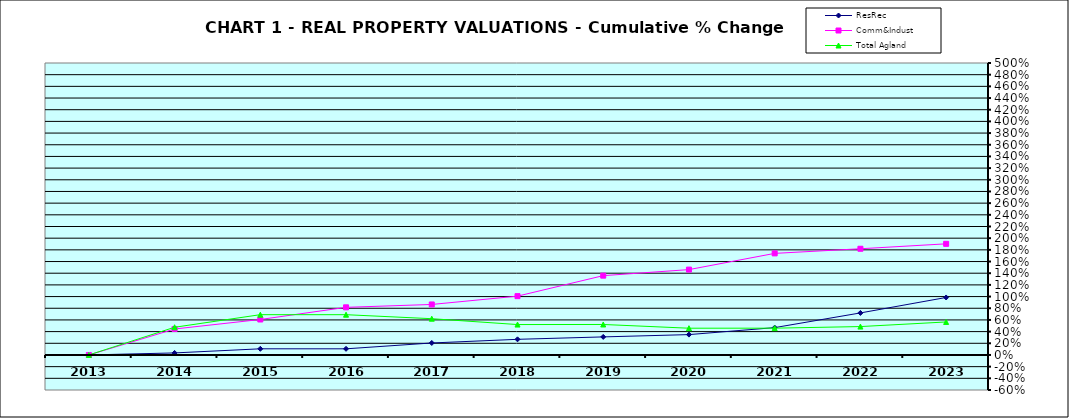
| Category | ResRec | Comm&Indust | Total Agland |
|---|---|---|---|
| 2013.0 | 0 | 0 | 0 |
| 2014.0 | 0.035 | 0.445 | 0.474 |
| 2015.0 | 0.105 | 0.607 | 0.69 |
| 2016.0 | 0.105 | 0.816 | 0.69 |
| 2017.0 | 0.205 | 0.865 | 0.621 |
| 2018.0 | 0.268 | 1.007 | 0.521 |
| 2019.0 | 0.309 | 1.358 | 0.522 |
| 2020.0 | 0.349 | 1.462 | 0.458 |
| 2021.0 | 0.468 | 1.739 | 0.459 |
| 2022.0 | 0.72 | 1.819 | 0.486 |
| 2023.0 | 0.984 | 1.903 | 0.565 |